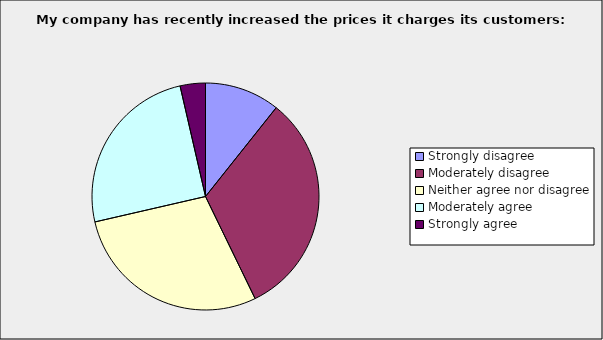
| Category | Series 0 |
|---|---|
| Strongly disagree | 0.107 |
| Moderately disagree | 0.321 |
| Neither agree nor disagree | 0.286 |
| Moderately agree | 0.25 |
| Strongly agree | 0.036 |